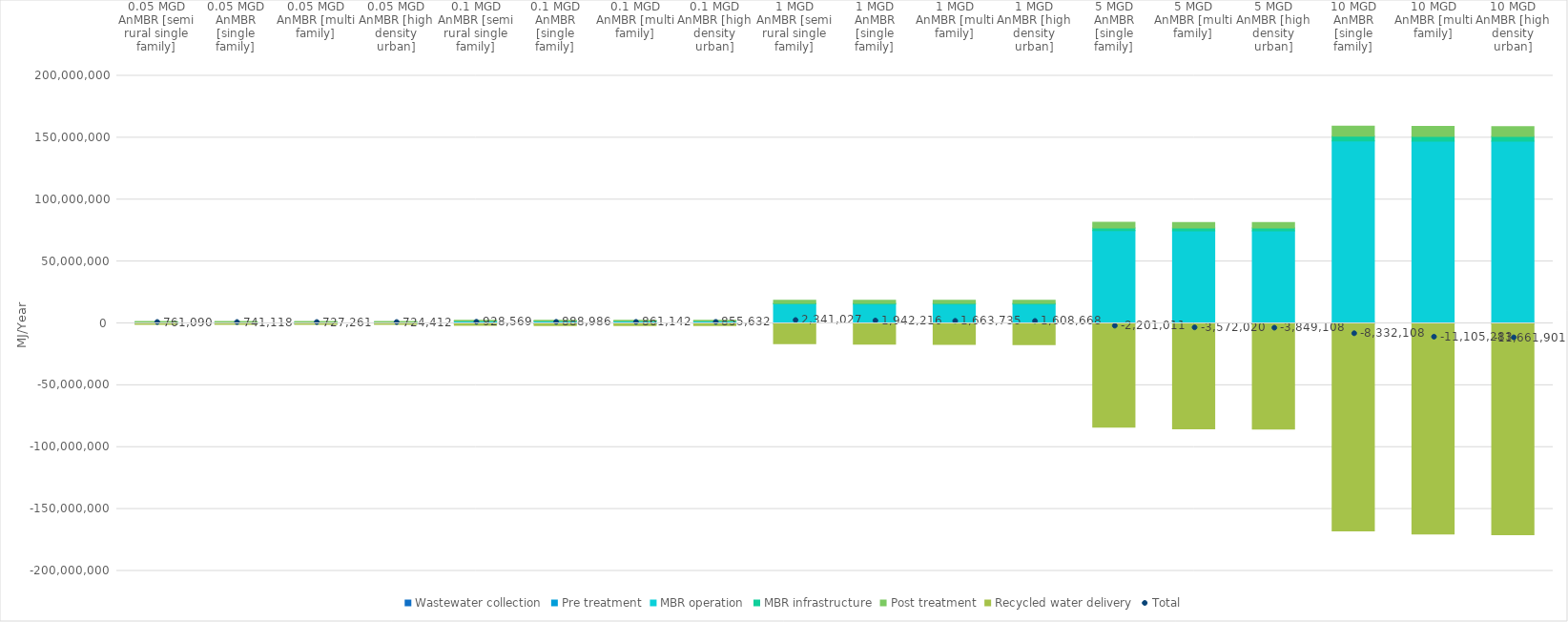
| Category | Wastewater collection | Pre treatment | MBR operation | MBR infrastructure | Post treatment | Recycled water delivery |
|---|---|---|---|---|---|---|
| 0.05 MGD AnMBR [semi rural single family] | 2782.008 | 44914.637 | 966762.508 | 26758.029 | 534976.397 | -815103.338 |
| 0.05 MGD AnMBR [single family] | 1459.805 | 44914.637 | 966762.508 | 26758.029 | 534976.397 | -833753.006 |
| 0.05 MGD AnMBR [multi family] | 370.935 | 44914.637 | 966762.508 | 26758.029 | 534976.397 | -846521.871 |
| 0.05 MGD AnMBR [high density urban] | 174.291 | 44914.637 | 966762.508 | 26758.029 | 534976.397 | -849173.796 |
| 0.1 MGD AnMBR [semi rural single family] | 5306.809 | 62551.973 | 1823045.417 | 27496.51 | 642002.678 | -1631834.054 |
| 0.1 MGD AnMBR [single family] | 2720.19 | 62551.973 | 1823045.417 | 27496.51 | 642002.678 | -1668830.628 |
| 0.1 MGD AnMBR [multi family] | 741.859 | 62551.973 | 1823045.417 | 27496.51 | 642002.678 | -1694696.114 |
| 0.1 MGD AnMBR [high density urban] | 367.917 | 62551.973 | 1823045.417 | 27496.51 | 642002.678 | -1699832.784 |
| 1 MGD AnMBR [semi rural single family] | 55639.64 | 197955.524 | 15466419.2 | 518521.15 | 2479824.108 | -16377332.5 |
| 1 MGD AnMBR [single family] | 27201.903 | 197955.524 | 15466419.2 | 518521.15 | 2479824.108 | -16747706.2 |
| 1 MGD AnMBR [multi family] | 7418.699 | 197955.524 | 15466419.2 | 518521.15 | 2479824.108 | -17006403.54 |
| 1 MGD AnMBR [high density urban] | 3554.633 | 197955.524 | 15466419.2 | 518521.15 | 2479824.108 | -17057606.58 |
| 5 MGD AnMBR [single family] | 118177.413 | 482682.128 | 74318620 | 2160854.6 | 4545469.192 | -83826814.2 |
| 5 MGD AnMBR [multi family] | 37093.48 | 482682.128 | 74318620 | 2160854.6 | 4545469.192 | -85116739.7 |
| 5 MGD AnMBR [high density urban] | 18020.11 | 482682.128 | 74318620 | 2160854.6 | 4545469.192 | -85374753.6 |
| 10 MGD AnMBR [single family] | 272019 | 736411.238 | 146352552 | 3888905.362 | 8019323.307 | -167601319 |
| 10 MGD AnMBR [multi family] | 79123.5 | 736411.238 | 146352552 | 3888905.362 | 8019323.307 | -170181598.4 |
| 10 MGD AnMBR [high density urban] | 38416.53 | 736411.238 | 146352552 | 3888905.362 | 8019323.307 | -170697509.5 |